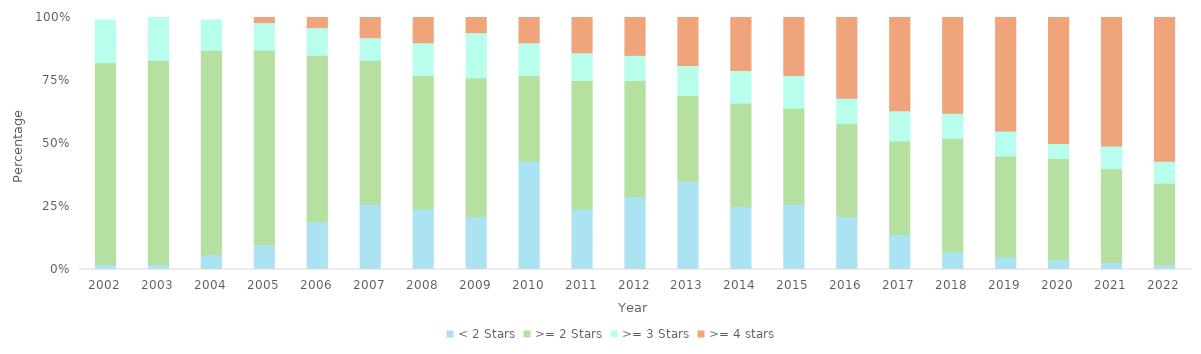
| Category | < 2 Stars | >= 2 Stars | >= 3 Stars | >= 4 stars |
|---|---|---|---|---|
| 2002.0 | 0.02 | 0.8 | 0.17 | 0 |
| 2003.0 | 0.02 | 0.81 | 0.17 | 0 |
| 2004.0 | 0.06 | 0.81 | 0.12 | 0 |
| 2005.0 | 0.1 | 0.77 | 0.11 | 0.02 |
| 2006.0 | 0.19 | 0.66 | 0.11 | 0.04 |
| 2007.0 | 0.26 | 0.57 | 0.09 | 0.08 |
| 2008.0 | 0.24 | 0.53 | 0.13 | 0.1 |
| 2009.0 | 0.21 | 0.55 | 0.18 | 0.06 |
| 2010.0 | 0.43 | 0.34 | 0.13 | 0.1 |
| 2011.0 | 0.24 | 0.51 | 0.11 | 0.15 |
| 2012.0 | 0.29 | 0.46 | 0.1 | 0.16 |
| 2013.0 | 0.35 | 0.34 | 0.12 | 0.19 |
| 2014.0 | 0.25 | 0.41 | 0.13 | 0.21 |
| 2015.0 | 0.26 | 0.38 | 0.13 | 0.24 |
| 2016.0 | 0.21 | 0.37 | 0.1 | 0.32 |
| 2017.0 | 0.14 | 0.37 | 0.12 | 0.37 |
| 2018.0 | 0.07 | 0.45 | 0.1 | 0.38 |
| 2019.0 | 0.05 | 0.4 | 0.1 | 0.46 |
| 2020.0 | 0.04 | 0.4 | 0.06 | 0.5 |
| 2021.0 | 0.03 | 0.37 | 0.09 | 0.52 |
| 2022.0 | 0.019 | 0.324 | 0.087 | 0.571 |